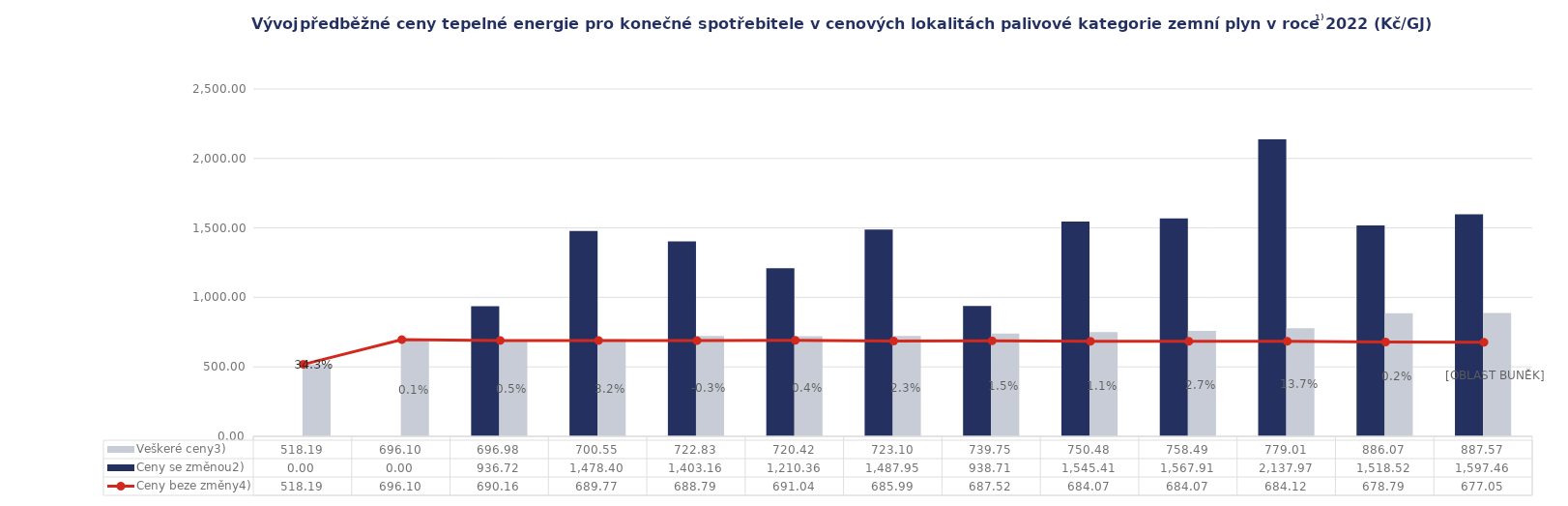
| Category | Ceny se změnou2) | Veškeré ceny3) |
|---|---|---|
|  | 0 | 518.187 |
|  | 0 | 696.096 |
|  | 936.716 | 696.981 |
|  | 1478.403 | 700.547 |
|  | 1403.161 | 722.827 |
|  | 1210.363 | 720.423 |
|  | 1487.948 | 723.103 |
|  | 938.714 | 739.749 |
|  | 1545.412 | 750.485 |
|  | 1567.915 | 758.488 |
|  | 2137.967 | 779.008 |
|  | 1518.524 | 886.073 |
|  | 1597.46 | 887.573 |